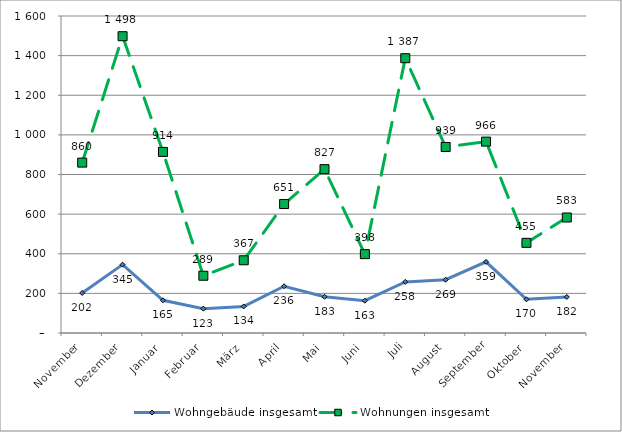
| Category | Wohngebäude insgesamt | Wohnungen insgesamt |
|---|---|---|
| November | 202 | 860 |
| Dezember | 345 | 1498 |
| Januar | 165 | 914 |
| Februar | 123 | 289 |
| März | 134 | 367 |
| April | 236 | 651 |
| Mai | 183 | 827 |
| Juni | 163 | 398 |
| Juli | 258 | 1387 |
| August | 269 | 939 |
| September | 359 | 966 |
| Oktober | 170 | 455 |
| November | 182 | 583 |